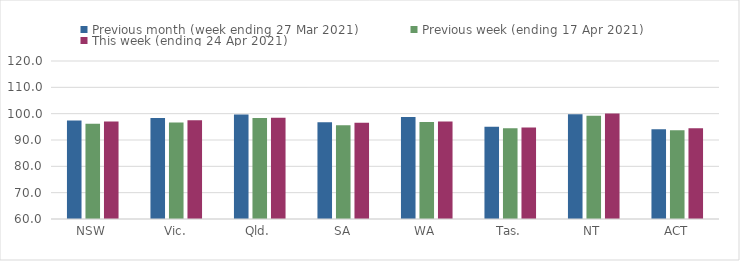
| Category | Previous month (week ending 27 Mar 2021) | Previous week (ending 17 Apr 2021) | This week (ending 24 Apr 2021) |
|---|---|---|---|
| NSW | 97.41 | 96.16 | 96.98 |
| Vic. | 98.32 | 96.65 | 97.52 |
| Qld. | 99.69 | 98.36 | 98.43 |
| SA | 96.72 | 95.62 | 96.57 |
| WA | 98.74 | 96.86 | 97 |
| Tas. | 95.01 | 94.46 | 94.79 |
| NT | 99.81 | 99.2 | 100.02 |
| ACT | 94.12 | 93.75 | 94.46 |